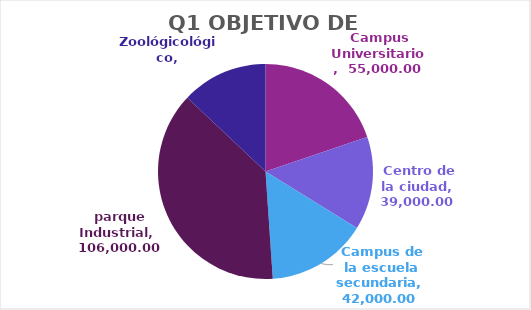
| Category | Series 0 |
|---|---|
| Campus Universitario | 55000 |
| Centro de la ciudad | 39000 |
| Campus de la escuela secundaria | 42000 |
| parque Industrial | 106000 |
| Zoológicológico | 36000 |